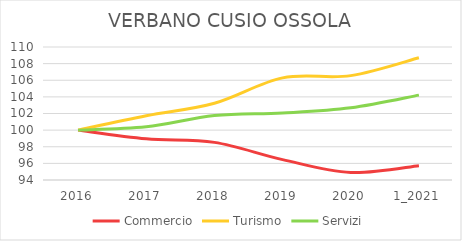
| Category | Commercio | Turismo | Servizi |
|---|---|---|---|
| 2016 | 100 | 100 | 100 |
| 2017 | 98.961 | 101.73 | 100.396 |
| 2018 | 98.527 | 103.233 | 101.752 |
| 2019 | 96.449 | 106.284 | 102.063 |
| 2020 | 94.903 | 106.557 | 102.685 |
| 1_2021 | 95.725 | 108.698 | 104.211 |